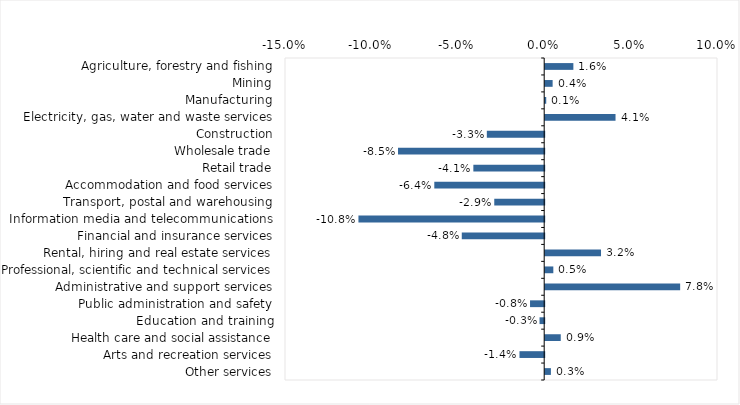
| Category | This week |
|---|---|
| Agriculture, forestry and fishing | 0.016 |
| Mining | 0.004 |
| Manufacturing | 0.001 |
| Electricity, gas, water and waste services | 0.041 |
| Construction | -0.033 |
| Wholesale trade | -0.085 |
| Retail trade | -0.041 |
| Accommodation and food services | -0.064 |
| Transport, postal and warehousing | -0.029 |
| Information media and telecommunications | -0.108 |
| Financial and insurance services | -0.048 |
| Rental, hiring and real estate services | 0.032 |
| Professional, scientific and technical services | 0.005 |
| Administrative and support services | 0.078 |
| Public administration and safety | -0.008 |
| Education and training | -0.003 |
| Health care and social assistance | 0.009 |
| Arts and recreation services | -0.014 |
| Other services | 0.003 |